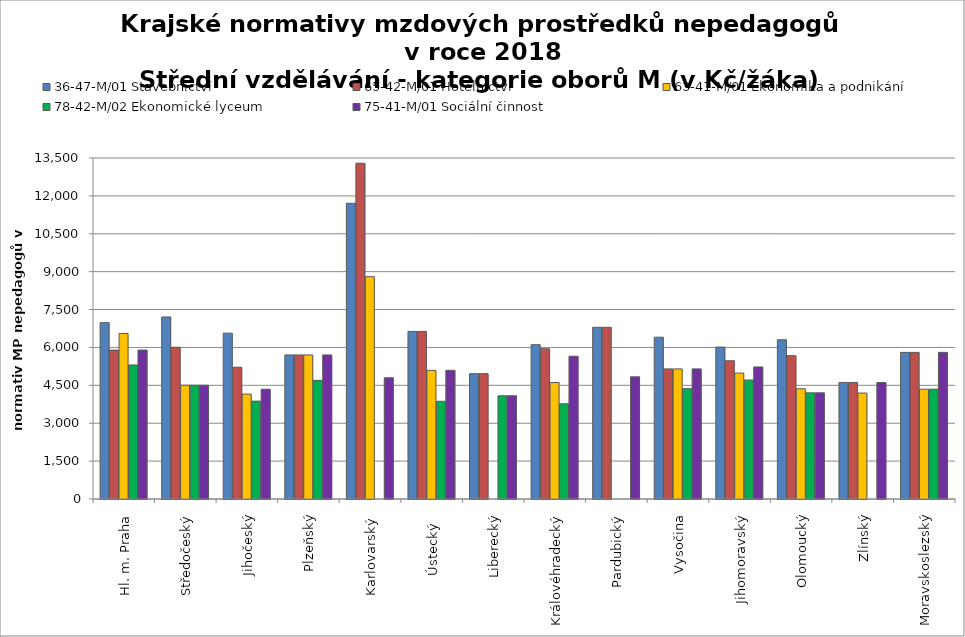
| Category | 36-47-M/01 Stavebnictví | 65-42-M/01 Hotelnictví | 63-41-M/01 Ekonomika a podnikání | 78-42-M/02 Ekonomické lyceum | 75-41-M/01 Sociální činnost |
|---|---|---|---|---|---|
| Hl. m. Praha | 6982.105 | 5896 | 6551.111 | 5306.4 | 5896 |
| Středočeský | 7207.543 | 6006.286 | 4504.714 | 4504.714 | 4504.714 |
| Jihočeský | 6566.743 | 5216.535 | 4154.269 | 3875.279 | 4345.505 |
| Plzeňský | 5703.429 | 5703.429 | 5703.429 | 4696.941 | 5703.429 |
| Karlovarský  | 11707.317 | 13292.308 | 8801.956 | 0 | 4800 |
| Ústecký   | 6634.612 | 6634.612 | 5093.895 | 3868.582 | 5093.895 |
| Liberecký | 4962.902 | 4962.902 | 0 | 4086.831 | 4086.831 |
| Královéhradecký | 6109.384 | 5949.411 | 4613.36 | 3767.96 | 5651.94 |
| Pardubický | 6798.162 | 6798.162 | 0 | 0 | 4837.154 |
| Vysočina | 6404.933 | 5150.507 | 5150.507 | 4369.56 | 5150.507 |
| Jihomoravský | 6014.493 | 5472.527 | 4984.985 | 4710.556 | 5227.798 |
| Olomoucký | 6303.814 | 5673.433 | 4364.179 | 4202.543 | 4202.543 |
| Zlínský | 4613.52 | 4613.52 | 4194.109 | 0 | 4613.52 |
| Moravskoslezský | 5805.381 | 5805.381 | 4348.023 | 4348.023 | 5805.381 |